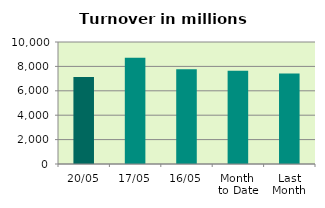
| Category | Series 0 |
|---|---|
| 20/05 | 7122.206 |
| 17/05 | 8710.869 |
| 16/05 | 7763.235 |
| Month 
to Date | 7644.824 |
| Last
Month | 7412.755 |